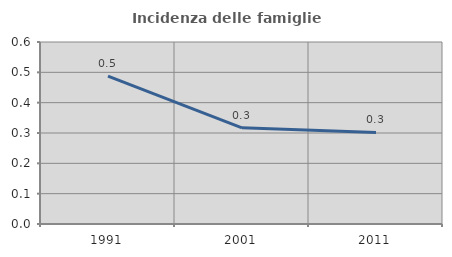
| Category | Incidenza delle famiglie numerose |
|---|---|
| 1991.0 | 0.488 |
| 2001.0 | 0.317 |
| 2011.0 | 0.302 |